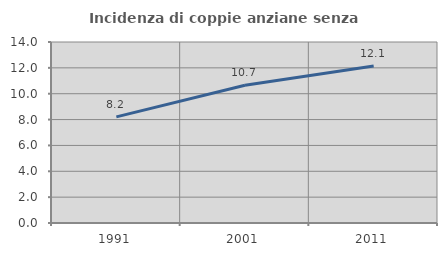
| Category | Incidenza di coppie anziane senza figli  |
|---|---|
| 1991.0 | 8.208 |
| 2001.0 | 10.652 |
| 2011.0 | 12.15 |